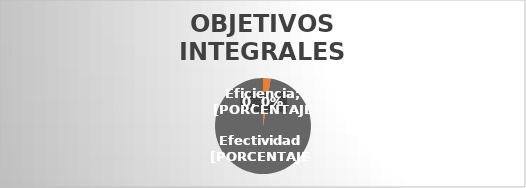
| Category | Eficacia Eficiencia  Efectividad |
|---|---|
| 0 | 0 |
| 1 | 0.026 |
| 2 | 0.974 |